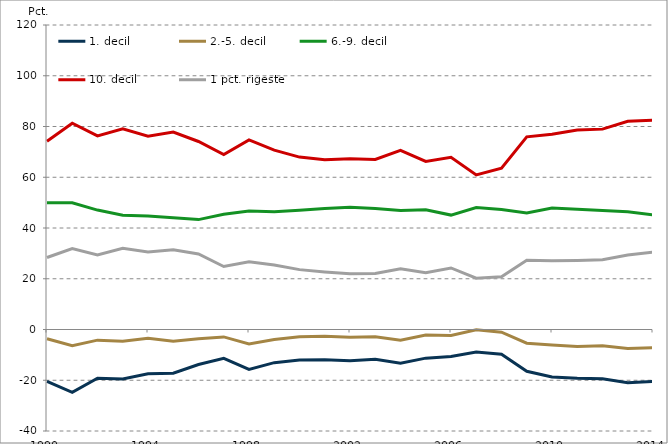
| Category | 1. decil | 2.-5. decil | 6.-9. decil | 10. decil | 1 pct. rigeste |
|---|---|---|---|---|---|
| 1990.0 | -20.409 | -3.67 | 49.915 | 74.164 | 28.389 |
| 1991.0 | -24.766 | -6.426 | 49.913 | 81.278 | 31.9 |
| 1992.0 | -19.175 | -4.195 | 47.062 | 76.309 | 29.401 |
| 1993.0 | -19.484 | -4.65 | 45.068 | 79.066 | 31.979 |
| 1994.0 | -17.477 | -3.458 | 44.775 | 76.16 | 30.575 |
| 1995.0 | -17.213 | -4.66 | 44.067 | 77.806 | 31.404 |
| 1996.0 | -13.801 | -3.605 | 43.311 | 74.095 | 29.787 |
| 1997.0 | -11.376 | -2.916 | 45.382 | 68.91 | 24.808 |
| 1998.0 | -15.72 | -5.661 | 46.683 | 74.698 | 26.718 |
| 1999.0 | -13.074 | -3.965 | 46.372 | 70.666 | 25.422 |
| 2000.0 | -12.003 | -2.904 | 46.958 | 67.949 | 23.595 |
| 2001.0 | -11.925 | -2.671 | 47.664 | 66.931 | 22.697 |
| 2002.0 | -12.336 | -3.06 | 48.133 | 67.263 | 21.924 |
| 2003.0 | -11.766 | -2.906 | 47.642 | 67.03 | 22.04 |
| 2004.0 | -13.3 | -4.193 | 46.924 | 70.568 | 23.929 |
| 2005.0 | -11.285 | -2.175 | 47.208 | 66.252 | 22.365 |
| 2006.0 | -10.617 | -2.345 | 45.089 | 67.874 | 24.26 |
| 2007.0 | -8.874 | -0.117 | 48.053 | 60.938 | 20.194 |
| 2008.0 | -9.743 | -1.081 | 47.281 | 63.544 | 20.815 |
| 2009.0 | -16.469 | -5.395 | 45.937 | 75.927 | 27.299 |
| 2010.0 | -18.723 | -6.095 | 47.883 | 76.935 | 27.083 |
| 2011.0 | -19.254 | -6.69 | 47.351 | 78.593 | 27.192 |
| 2012.0 | -19.453 | -6.411 | 46.9 | 78.965 | 27.468 |
| 2013.0 | -20.963 | -7.502 | 46.419 | 82.046 | 29.383 |
| 2014.0 | -20.454 | -7.169 | 45.131 | 82.492 | 30.454 |